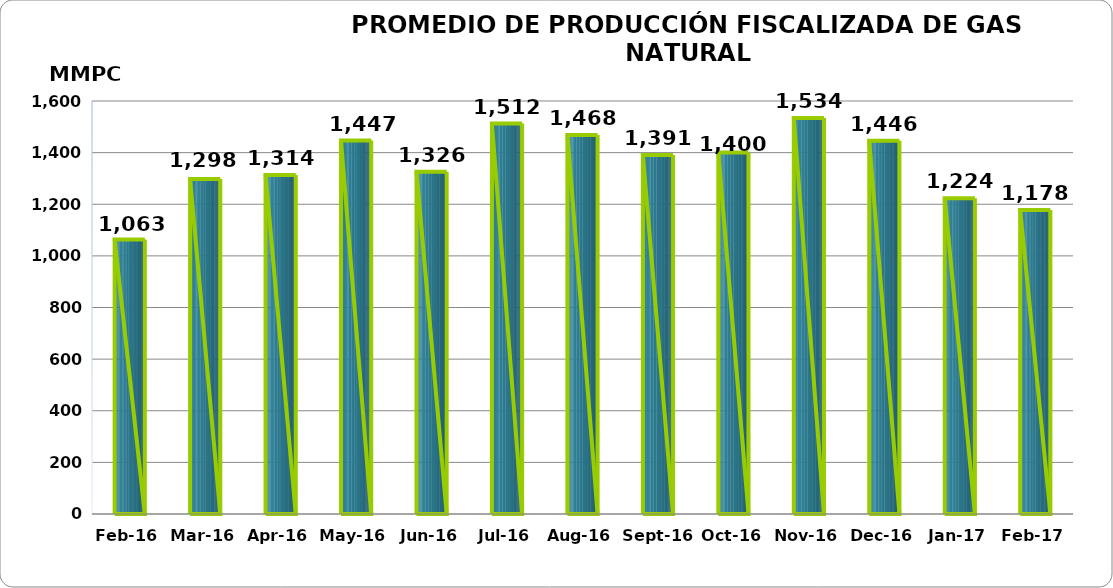
| Category | Series 0 |
|---|---|
| 2016-02-01 | 1063225.969 |
| 2016-03-01 | 1297819.673 |
| 2016-04-01 | 1313613.867 |
| 2016-05-01 | 1446528.161 |
| 2016-06-01 | 1326088.967 |
| 2016-07-01 | 1512372 |
| 2016-08-01 | 1468104.525 |
| 2016-09-01 | 1391000.053 |
| 2016-10-01 | 1400096.432 |
| 2016-11-01 | 1534268.686 |
| 2016-12-01 | 1445701.779 |
| 2017-01-01 | 1223514.523 |
| 2017-02-01 | 1177591.973 |